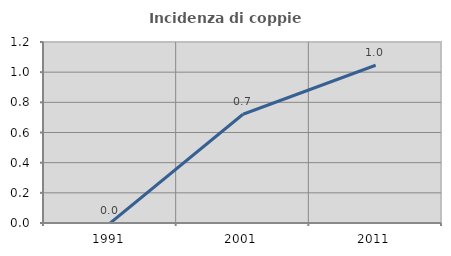
| Category | Incidenza di coppie miste |
|---|---|
| 1991.0 | 0 |
| 2001.0 | 0.721 |
| 2011.0 | 1.046 |